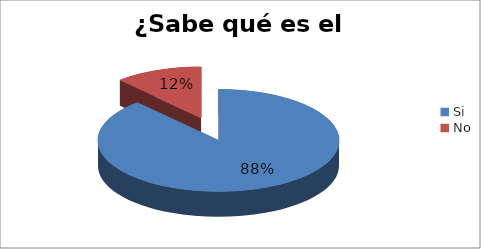
| Category | Series 0 |
|---|---|
| Si | 15 |
| No | 2 |